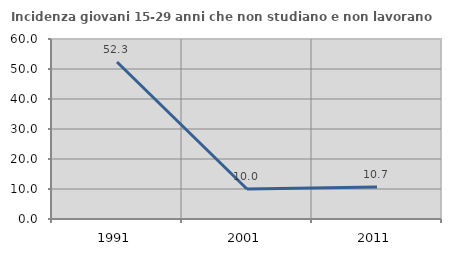
| Category | Incidenza giovani 15-29 anni che non studiano e non lavorano  |
|---|---|
| 1991.0 | 52.34 |
| 2001.0 | 10 |
| 2011.0 | 10.695 |